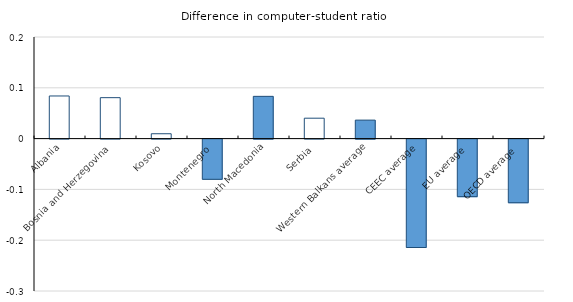
| Category | Computer-student ratio |
|---|---|
| Albania | 0.084 |
| Bosnia and Herzegovina | 0.081 |
| Kosovo | 0.01 |
| Montenegro | -0.079 |
| North Macedonia | 0.083 |
| Serbia | 0.04 |
| Western Balkans average | 0.036 |
| CEEC average | -0.213 |
| EU average | -0.113 |
| OECD average | -0.125 |